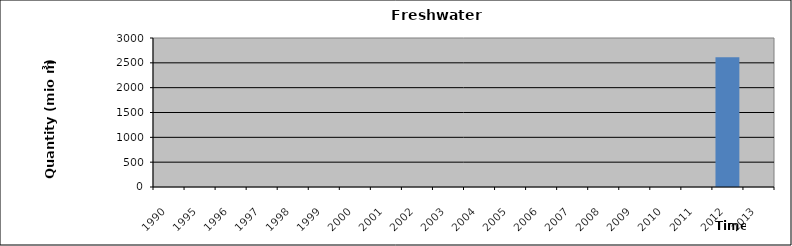
| Category | Series 0 |
|---|---|
| 1990.0 | 0 |
| 1995.0 | 0 |
| 1996.0 | 0 |
| 1997.0 | 0 |
| 1998.0 | 0 |
| 1999.0 | 0 |
| 2000.0 | 0 |
| 2001.0 | 0 |
| 2002.0 | 0 |
| 2003.0 | 0 |
| 2004.0 | 0 |
| 2005.0 | 0 |
| 2006.0 | 0 |
| 2007.0 | 0 |
| 2008.0 | 0 |
| 2009.0 | 0 |
| 2010.0 | 0 |
| 2011.0 | 0 |
| 2012.0 | 2613 |
| 2013.0 | 0 |